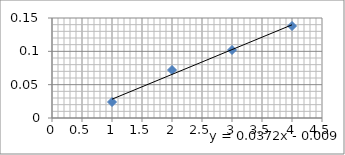
| Category | Series 0 |
|---|---|
| 1.0 | 0.024 |
| 2.0 | 0.072 |
| 3.0 | 0.102 |
| 4.0 | 0.138 |